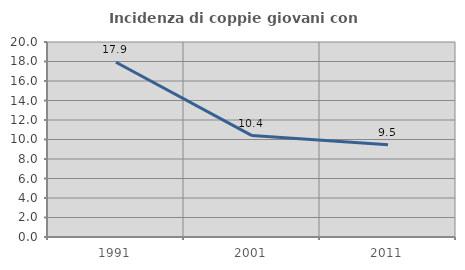
| Category | Incidenza di coppie giovani con figli |
|---|---|
| 1991.0 | 17.923 |
| 2001.0 | 10.4 |
| 2011.0 | 9.452 |